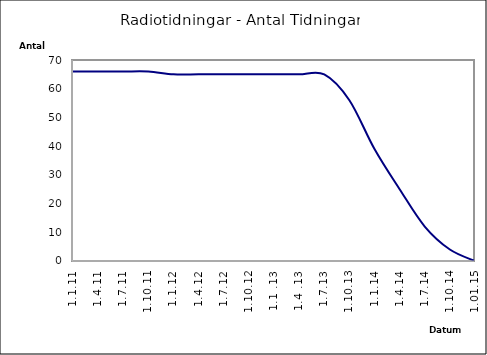
| Category | Series 0 |
|---|---|
| 1.1.11 | 66 |
| 1.4.11 | 66 |
| 1.7.11 | 66 |
| 1.10.11 | 66 |
| 1.1.12 | 65 |
| 1.4.12 | 65 |
| 1.7.12 | 65 |
| 1.10.12 | 65 |
| 1.1 .13 | 65 |
| 1.4 .13 | 65 |
| 1.7.13 | 65 |
| 1.10.13 | 56 |
| 1.1.14 | 39 |
| 1.4.14 | 25 |
| 1.7.14 | 12 |
| 1.10.14 | 4 |
| 1.01.15 | 0 |